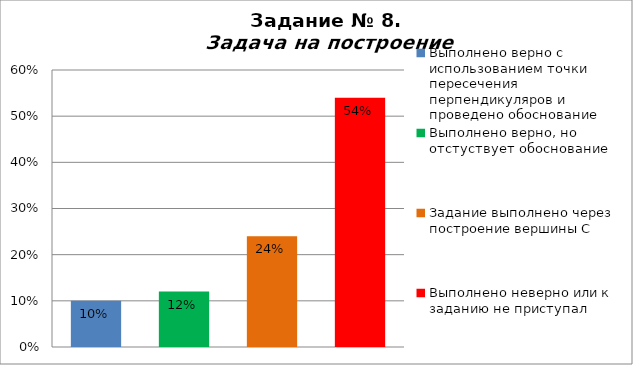
| Category | Задача на построение |
|---|---|
| Выполнено верно с использованием точки пересечения перпендикуляров и проведено обоснование | 0.1 |
| Выполнено верно, но отстуствует обоснование | 0.12 |
| Задание выполнено через построение вершины С | 0.24 |
| Выполнено неверно или к заданию не приступал | 0.54 |